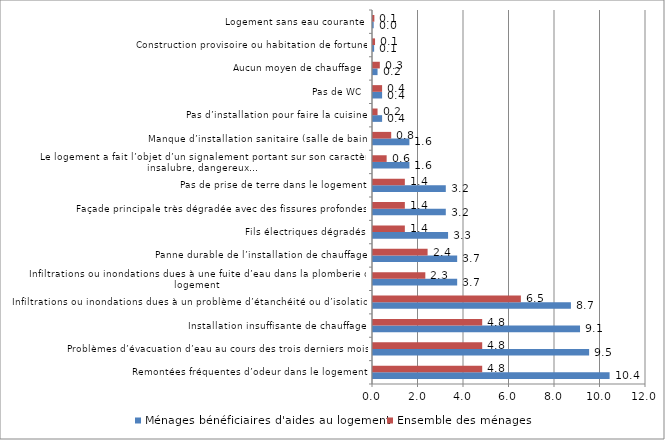
| Category | Ménages bénéficiaires d'aides au logement | Ensemble des ménages |
|---|---|---|
| Remontées fréquentes d’odeur dans le logement | 10.4 | 4.8 |
| Problèmes d’évacuation d’eau au cours des trois derniers mois | 9.5 | 4.8 |
| Installation insuffisante de chauffage | 9.1 | 4.8 |
| Infiltrations ou inondations dues à un problème d’étanchéité ou d’isolation | 8.7 | 6.5 |
| Infiltrations ou inondations dues à une fuite d’eau dans la plomberie du logement | 3.7 | 2.3 |
| Panne durable de l’installation de chauffage | 3.7 | 2.4 |
| Fils électriques dégradés | 3.3 | 1.4 |
| Façade principale très dégradée avec des fissures profondes | 3.2 | 1.4 |
| Pas de prise de terre dans le logement | 3.2 | 1.4 |
| Le logement a fait l’objet d’un signalement portant sur son caractère insalubre, dangereux… | 1.6 | 0.6 |
| Manque d’installation sanitaire (salle de bain) | 1.6 | 0.8 |
| Pas d’installation pour faire la cuisine | 0.4 | 0.2 |
| Pas de WC | 0.4 | 0.4 |
| Aucun moyen de chauffage | 0.2 | 0.3 |
| Construction provisoire ou habitation de fortune | 0.05 | 0.09 |
| Logement sans eau courante | 0.03 | 0.06 |